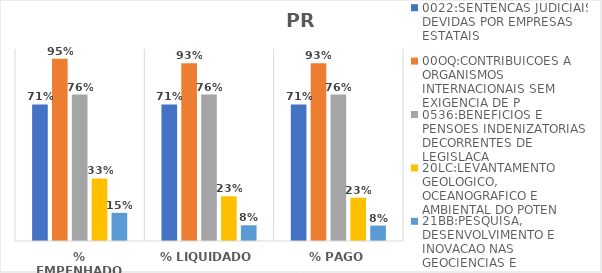
| Category | 0022:SENTENCAS JUDICIAIS DEVIDAS POR EMPRESAS ESTATAIS | 00OQ:CONTRIBUICOES A ORGANISMOS INTERNACIONAIS SEM EXIGENCIA DE P | 0536:BENEFICIOS E PENSOES INDENIZATORIAS DECORRENTES DE LEGISLACA | 20LC:LEVANTAMENTO GEOLOGICO, OCEANOGRAFICO E AMBIENTAL DO POTEN | 21BB:PESQUISA, DESENVOLVIMENTO E INOVACAO NAS GEOCIENCIAS E |
|---|---|---|---|---|---|
| % EMPENHADO | 0.711 | 0.95 | 0.763 | 0.326 | 0.147 |
| % LIQUIDADO | 0.711 | 0.926 | 0.763 | 0.233 | 0.082 |
| % PAGO | 0.711 | 0.926 | 0.763 | 0.225 | 0.08 |